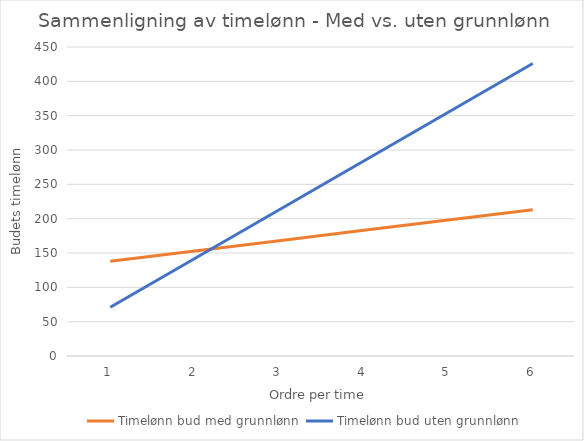
| Category | Timelønn bud med grunnlønn | Timelønn bud uten grunnlønn |
|---|---|---|
| 0 | 138 | 71 |
| 1 | 153 | 142 |
| 2 | 168 | 213 |
| 3 | 183 | 284 |
| 4 | 198 | 355 |
| 5 | 213 | 426 |